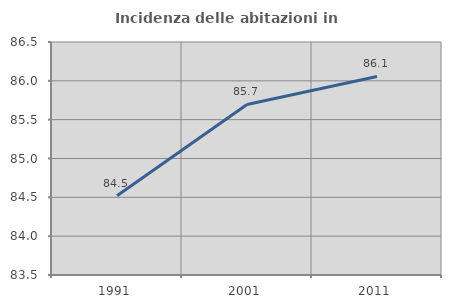
| Category | Incidenza delle abitazioni in proprietà  |
|---|---|
| 1991.0 | 84.519 |
| 2001.0 | 85.696 |
| 2011.0 | 86.056 |